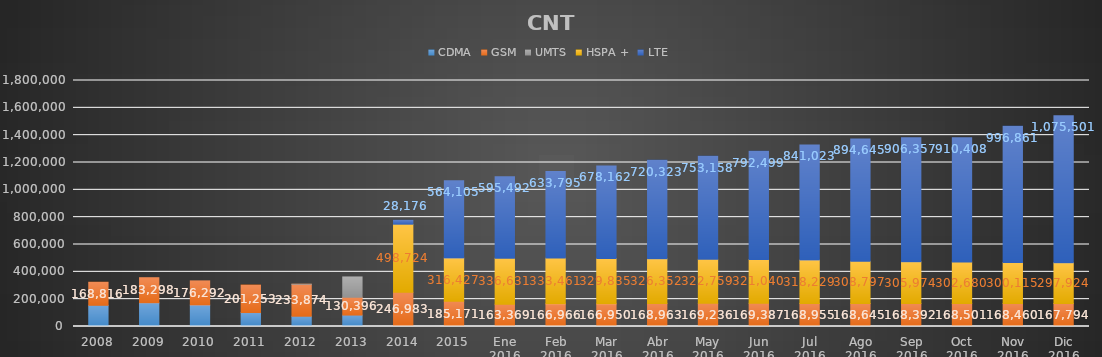
| Category | CDMA | GSM | UMTS | HSPA + | LTE |
|---|---|---|---|---|---|
| 2008 | 155151 | 168816 | 0 | 0 | 0 |
| 2009 | 173602 | 183298 | 0 | 0 | 0 |
| 2010 | 157438 | 176292 | 0 | 0 | 0 |
| 2011 | 102115 | 201253 | 0 | 0 | 0 |
| 2012 | 75179 | 233874 | 218 | 0 | 0 |
| 2013 | 83748 | 130396 | 148416 | 0 | 0 |
| 2014 | 3009 | 246983 | 0 | 498724 | 28176 |
| 2015 | 0 | 185171 | 0 | 316427 | 564105 |
| Ene 2016 | 0 | 163369 | 0 | 336631 | 595492 |
| Feb 2016 | 0 | 166966 | 0 | 333461 | 633795 |
| Mar 2016 | 0 | 166950 | 0 | 329835 | 678162 |
| Abr 2016 | 0 | 168963 | 0 | 326352 | 720323 |
| May 2016 | 0 | 169236 | 0 | 322759 | 753158 |
| Jun 2016 | 0 | 169387 | 0 | 321040 | 792499 |
| Jul 2016 | 0 | 168955 | 0 | 318229 | 841023 |
| Ago 2016 | 0 | 168645 | 0 | 308797 | 894645 |
| Sep 2016 | 0 | 168392 | 0 | 305974 | 906357 |
| Oct 2016 | 0 | 168501 | 0 | 302680 | 910408 |
| Nov 2016 | 0 | 168460 | 0 | 300115 | 996861 |
| Dic 2016 | 0 | 167794 | 0 | 297924 | 1075501 |